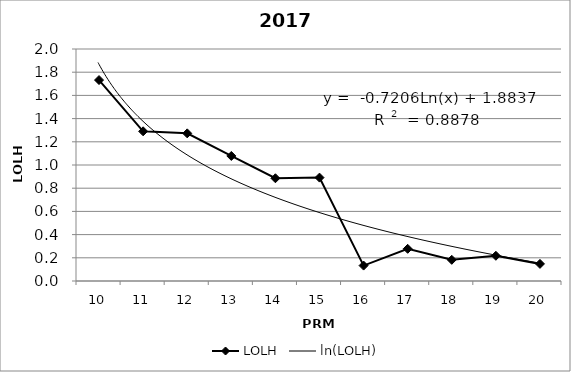
| Category | LOLH |
|---|---|
| 10.0 | 1.732 |
| 11.0 | 1.29 |
| 12.0 | 1.273 |
| 13.0 | 1.078 |
| 14.0 | 0.886 |
| 15.0 | 0.891 |
| 16.0 | 0.133 |
| 17.0 | 0.277 |
| 18.0 | 0.183 |
| 19.0 | 0.217 |
| 20.0 | 0.147 |